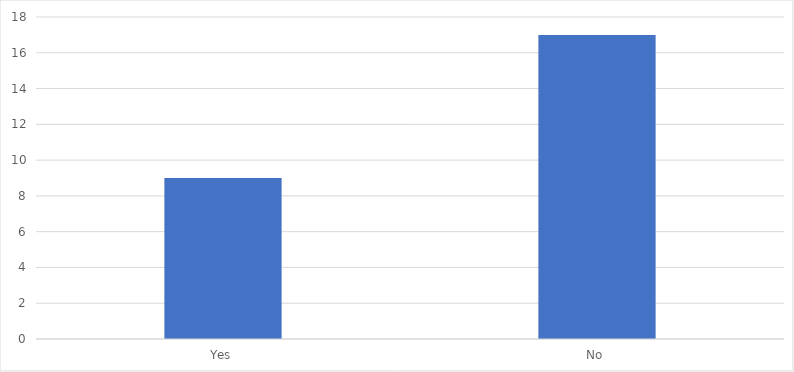
| Category | Number of Responses |
|---|---|
| Yes | 9 |
| No | 17 |